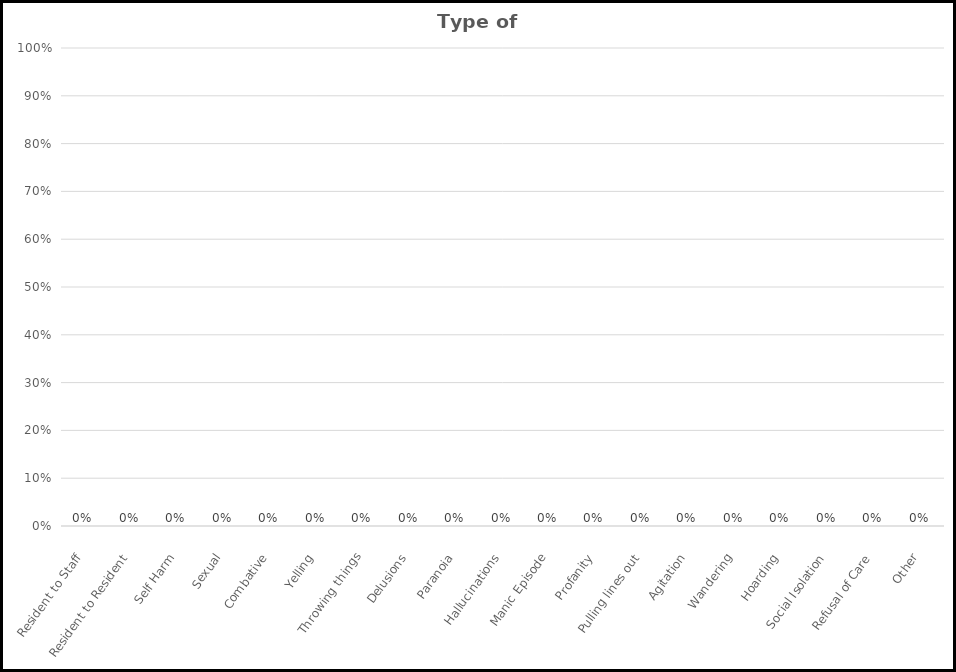
| Category | Type of Behavior |
|---|---|
| Resident to Staff | 0 |
| Resident to Resident | 0 |
| Self Harm | 0 |
| Sexual | 0 |
| Combative | 0 |
| Yelling | 0 |
| Throwing things | 0 |
| Delusions | 0 |
| Paranoia | 0 |
| Hallucinations | 0 |
| Manic Episode | 0 |
| Profanity | 0 |
| Pulling lines out | 0 |
| Agitation | 0 |
| Wandering | 0 |
| Hoarding | 0 |
| Social Isolation | 0 |
| Refusal of Care | 0 |
| Other | 0 |